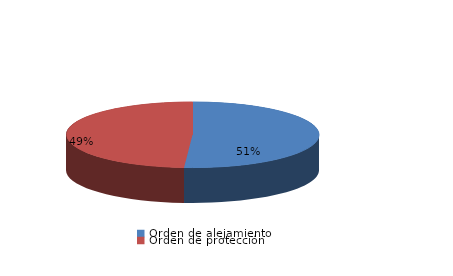
| Category | Series 0 |
|---|---|
| Orden de alejamiento | 24 |
| Orden de protección | 23 |